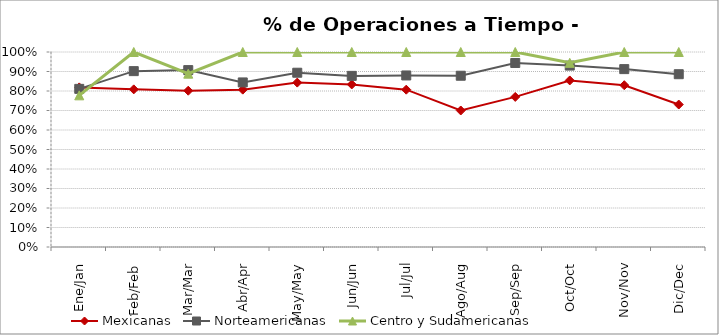
| Category | Mexicanas | Norteamericanas | Centro y Sudamericanas |
|---|---|---|---|
| Ene/Jan | 0.819 | 0.811 | 0.778 |
| Feb/Feb | 0.808 | 0.902 | 1 |
| Mar/Mar | 0.802 | 0.907 | 0.889 |
| Abr/Apr | 0.807 | 0.844 | 1 |
| May/May | 0.843 | 0.894 | 1 |
| Jun/Jun | 0.834 | 0.878 | 1 |
| Jul/Jul | 0.807 | 0.88 | 1 |
| Ago/Aug | 0.7 | 0.878 | 1 |
| Sep/Sep | 0.77 | 0.944 | 1 |
| Oct/Oct | 0.854 | 0.93 | 0.944 |
| Nov/Nov | 0.83 | 0.912 | 1 |
| Dic/Dec | 0.731 | 0.886 | 1 |